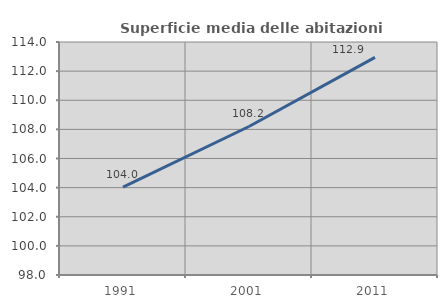
| Category | Superficie media delle abitazioni occupate |
|---|---|
| 1991.0 | 104.03 |
| 2001.0 | 108.198 |
| 2011.0 | 112.944 |